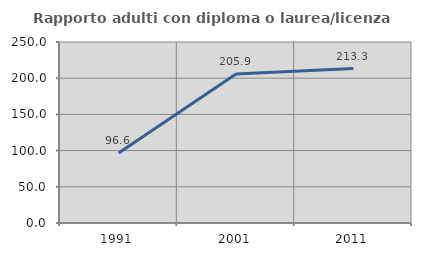
| Category | Rapporto adulti con diploma o laurea/licenza media  |
|---|---|
| 1991.0 | 96.552 |
| 2001.0 | 205.868 |
| 2011.0 | 213.345 |